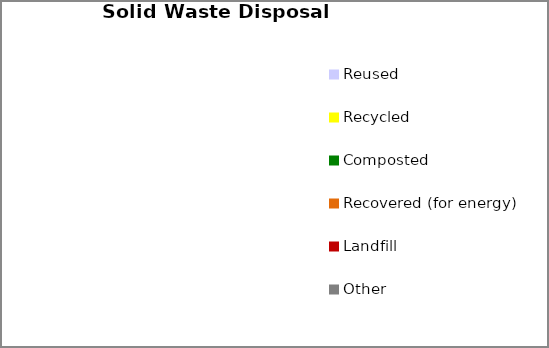
| Category | Series 0 |
|---|---|
| Reused | 0 |
| Recycled | 0 |
| Composted | 0 |
| Recovered (for energy) | 0 |
| Landfill | 0 |
| Other | 0 |